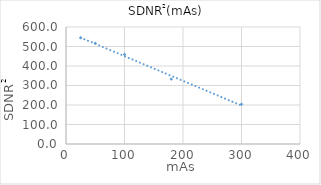
| Category | Series 0 |
|---|---|
| 25.0 | 544.444 |
| 50.0 | 516.529 |
| 100.0 | 459.184 |
| 180.0 | 332.526 |
| 300.0 | 204.082 |